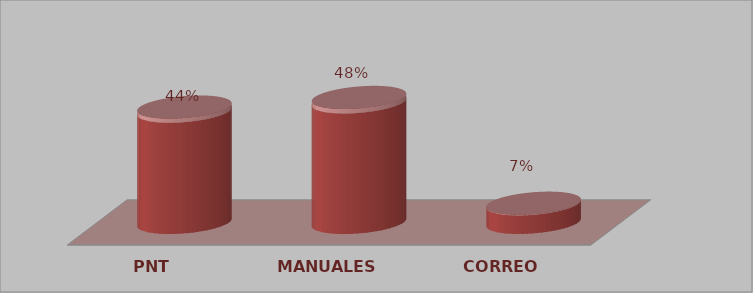
| Category | Series 0 | Series 1 |
|---|---|---|
| PNT | 12 | 0.444 |
| MANUALES | 13 | 0.481 |
| CORREO | 2 | 0.074 |